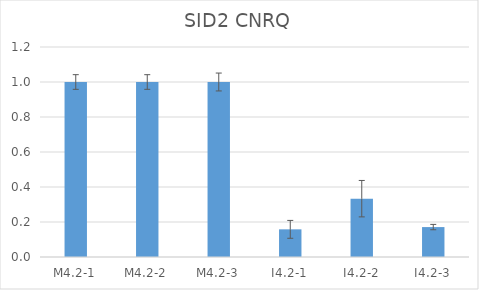
| Category | SID2 CNRQ |
|---|---|
| M4.2-1 | 1 |
| M4.2-2 | 1 |
| M4.2-3 | 1 |
| I4.2-1 | 0.158 |
| I4.2-2 | 0.333 |
| I4.2-3 | 0.171 |